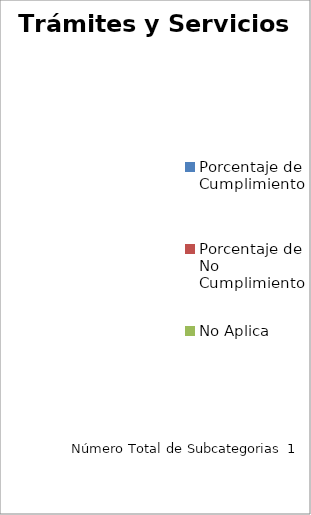
| Category | Trámites y Servicios |
|---|---|
| Porcentaje de Cumplimiento | 0 |
| Porcentaje de No Cumplimiento | 0 |
| No Aplica | 0 |